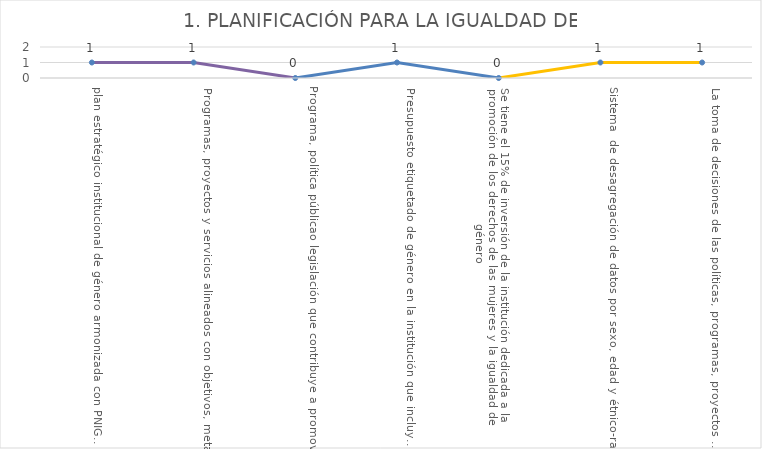
| Category | Series 0 |
|---|---|
| plan estratégico institucional de género armonizada con PNIG, PND                                                                                      | 1 |
| Programas, proyectos y servicios alineados con objetivos, metas e indicadores de género  que se monitorean y reportan periódicamente.        | 1 |
| Programa, política públicao legislación que contribuye a promover al menos 1 de las 3 autonomías (económica, política y física) en el marco de los indicadores de la Agenda 2030 de la temática de la institución. | 0 |
| Presupuesto etiquetado de género en la institución que incluye programas, servicios y proyectos a favor de la igualdad de género y el empoderamiento de las mujeres.         | 1 |
| _x000d_Se tiene el 15% de inversión de la institución dedicada a la promoción de los derechos de las mujeres y la igualdad de género  _x000d__x000d_ | 0 |
| Sistema  de desagregación de datos por sexo, edad y étnico-racial para medir programas, proyectos, servicios y metas que se usan periódicamente.   | 1 |
| La toma de decisiones de las políticas, programas, proyectos y servicios están basadas en los datos desagregados por sexo, edad y étnico-racial arrojados por estos registros. | 1 |